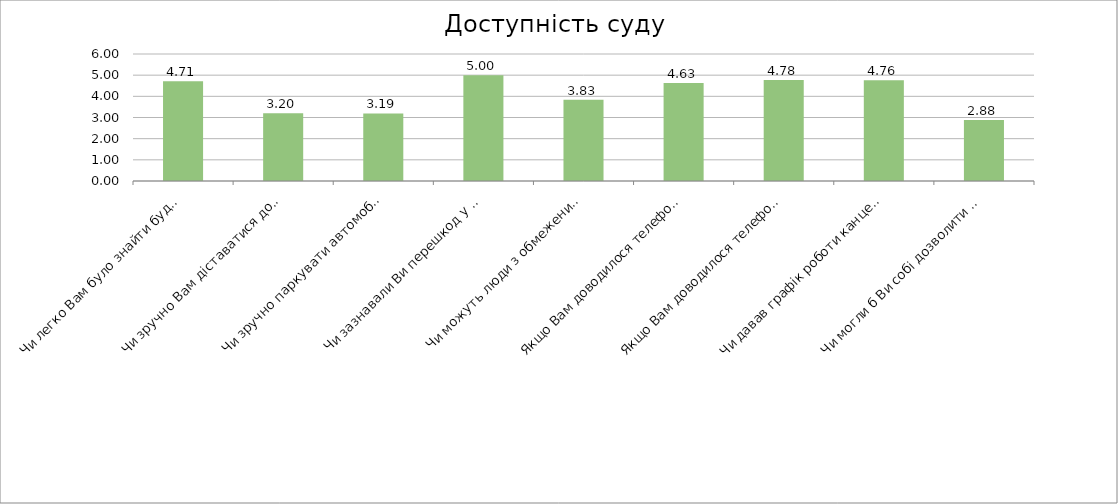
| Category | Series 0 |
|---|---|
| Чи легко Вам було знайти будівлю суду? | 4.714 |
| Чи зручно Вам діставатися до будівлі суду громадським транспортом? | 3.2 |
| Чи зручно паркувати автомобіль (достатньо паркувальних місць) біля будівлі суду? | 3.19 |
| Чи зазнавали Ви перешкод у доступі до приміщень суду через охорону? | 5 |
| Чи можуть люди з обмеженими можливостями безперешкодно потрапити до приміщення суду і користуватися послугами суду? | 3.833 |
| Якщо Вам доводилося телефонувати до суду, чи завжди вдавалось додзвонитися? | 4.625 |
| Якщо Вам доводилося телефонувати до суду, чи завжди вдавалось отримати потрібну інформацію? | 4.775 |
| Чи давав графік роботи канцелярії суду можливість вчасно та безперешкодно вирішувати Ваші справи у суді | 4.755 |
| Чи могли б Ви собі дозволити витрати на послуги адвоката у разі необхідності? | 2.881 |